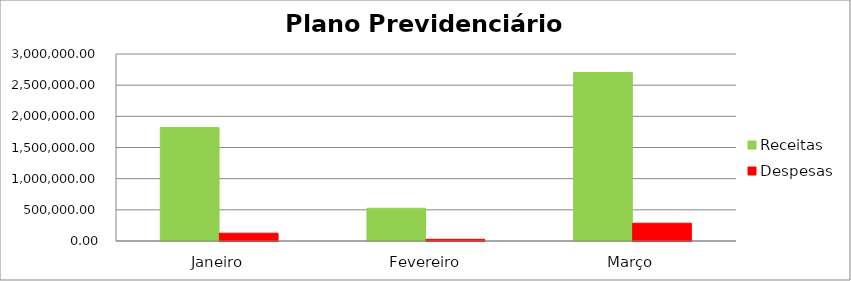
| Category | Receitas | Despesas |
|---|---|---|
| Janeiro | 1819269.95 | 125285.85 |
| Fevereiro | 524715.71 | 26977.14 |
| Março | 2703157.36 | 285077.52 |